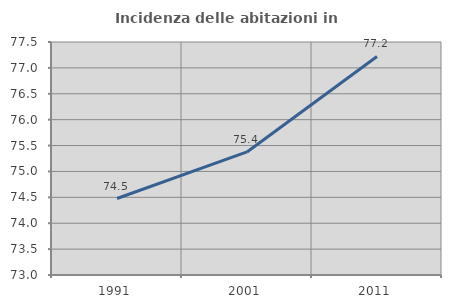
| Category | Incidenza delle abitazioni in proprietà  |
|---|---|
| 1991.0 | 74.477 |
| 2001.0 | 75.377 |
| 2011.0 | 77.221 |